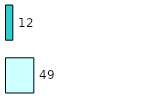
| Category | Series 0 | Series 1 |
|---|---|---|
| 0 | 49 | 12 |